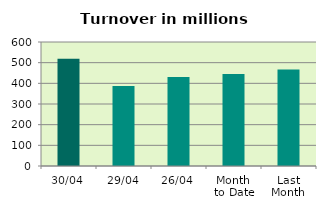
| Category | Series 0 |
|---|---|
| 30/04 | 518.68 |
| 29/04 | 387.04 |
| 26/04 | 431.182 |
| Month 
to Date | 444.663 |
| Last
Month | 466.511 |